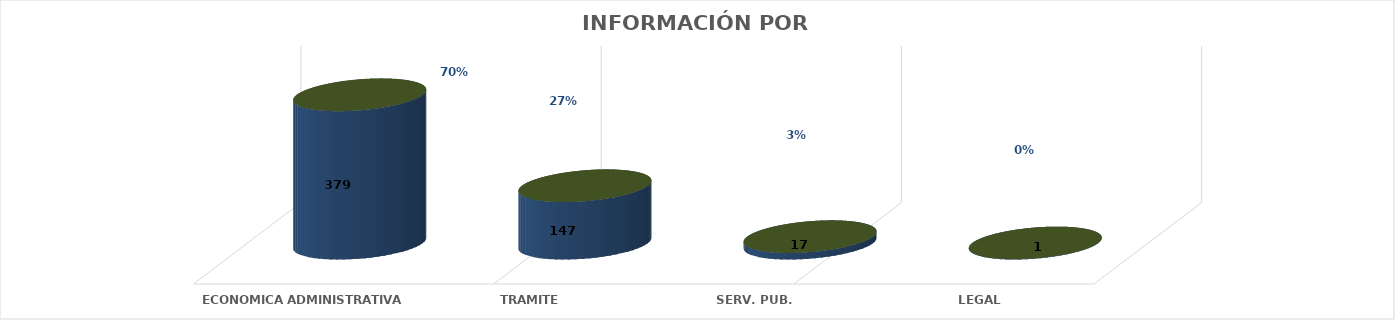
| Category | Series 0 | Series 1 | Series 2 | Series 3 | Series 4 |
|---|---|---|---|---|---|
| ECONOMICA ADMINISTRATIVA |  |  |  | 379 | 0.697 |
| TRAMITE |  |  |  | 147 | 0.27 |
| SERV. PUB. |  |  |  | 17 | 0.031 |
| LEGAL |  |  |  | 1 | 0.002 |